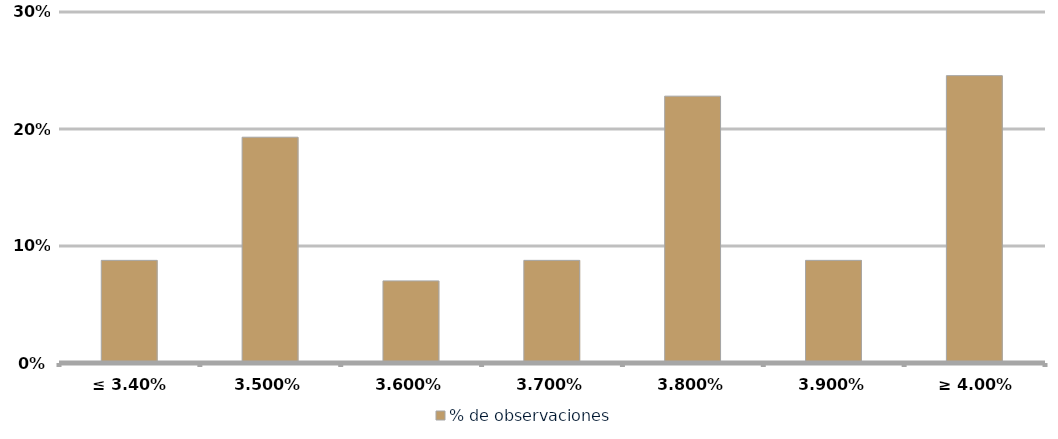
| Category | % de observaciones  |
|---|---|
| ≤ 3.40% | 0.088 |
| 3.50% | 0.193 |
| 3.60% | 0.07 |
| 3.70% | 0.088 |
| 3.80% | 0.228 |
| 3.90% | 0.088 |
| ≥ 4.00% | 0.246 |